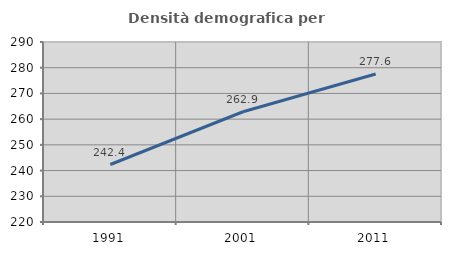
| Category | Densità demografica |
|---|---|
| 1991.0 | 242.356 |
| 2001.0 | 262.878 |
| 2011.0 | 277.571 |